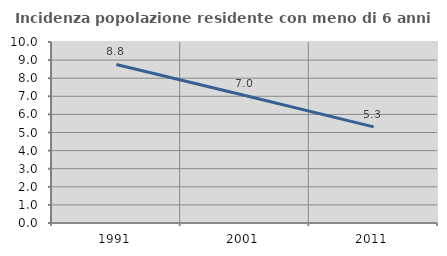
| Category | Incidenza popolazione residente con meno di 6 anni |
|---|---|
| 1991.0 | 8.757 |
| 2001.0 | 7.042 |
| 2011.0 | 5.31 |